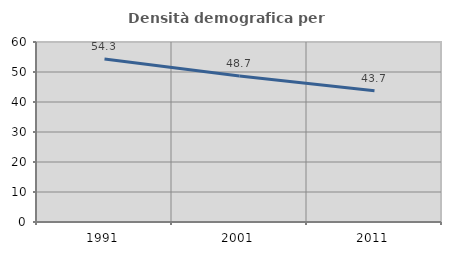
| Category | Densità demografica |
|---|---|
| 1991.0 | 54.349 |
| 2001.0 | 48.699 |
| 2011.0 | 43.727 |